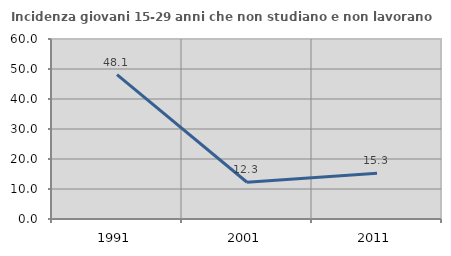
| Category | Incidenza giovani 15-29 anni che non studiano e non lavorano  |
|---|---|
| 1991.0 | 48.123 |
| 2001.0 | 12.26 |
| 2011.0 | 15.259 |